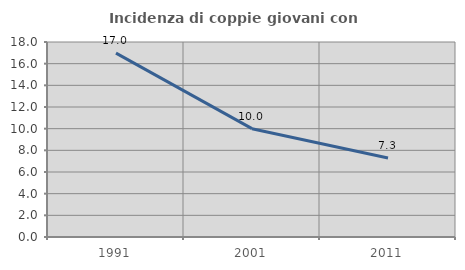
| Category | Incidenza di coppie giovani con figli |
|---|---|
| 1991.0 | 16.974 |
| 2001.0 | 10 |
| 2011.0 | 7.287 |